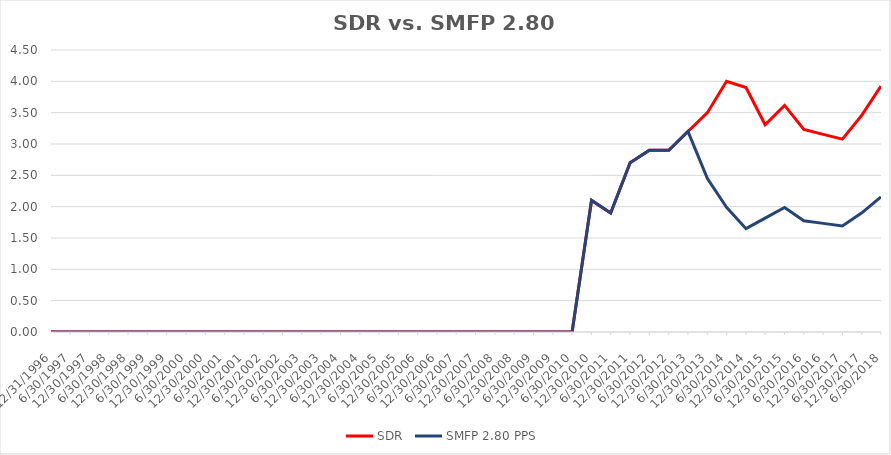
| Category | SDR | SMFP 2.80 PPS |
|---|---|---|
| 12/31/96 | 0 | 0 |
| 6/30/97 | 0 | 0 |
| 12/31/97 | 0 | 0 |
| 6/30/98 | 0 | 0 |
| 12/31/98 | 0 | 0 |
| 6/30/99 | 0 | 0 |
| 12/31/99 | 0 | 0 |
| 6/30/00 | 0 | 0 |
| 12/31/00 | 0 | 0 |
| 6/30/01 | 0 | 0 |
| 12/31/01 | 0 | 0 |
| 6/30/02 | 0 | 0 |
| 12/31/02 | 0 | 0 |
| 6/30/03 | 0 | 0 |
| 12/31/03 | 0 | 0 |
| 6/30/04 | 0 | 0 |
| 12/31/04 | 0 | 0 |
| 6/30/05 | 0 | 0 |
| 12/31/05 | 0 | 0 |
| 6/30/06 | 0 | 0 |
| 12/31/06 | 0 | 0 |
| 6/30/07 | 0 | 0 |
| 12/31/07 | 0 | 0 |
| 6/30/08 | 0 | 0 |
| 12/31/08 | 0 | 0 |
| 6/30/09 | 0 | 0 |
| 12/31/09 | 0 | 0 |
| 6/30/10 | 0 | 0 |
| 12/31/10 | 2.1 | 2.1 |
| 6/30/11 | 1.9 | 1.9 |
| 12/31/11 | 2.7 | 2.7 |
| 6/30/12 | 2.9 | 2.9 |
| 12/31/12 | 2.9 | 2.9 |
| 6/30/13 | 3.2 | 3.2 |
| 12/31/13 | 3.5 | 2.447 |
| 6/30/14 | 4 | 1.989 |
| 12/31/14 | 3.9 | 1.649 |
| 6/30/15 | 3.308 | 1.818 |
| 12/31/15 | 3.615 | 1.987 |
| 6/30/16 | 3.231 | 1.775 |
| 12/31/16 | 3.154 | 1.733 |
| 6/30/17 | 3.077 | 1.691 |
| 12/31/17 | 3.462 | 1.902 |
| 6/30/18 | 3.923 | 2.156 |